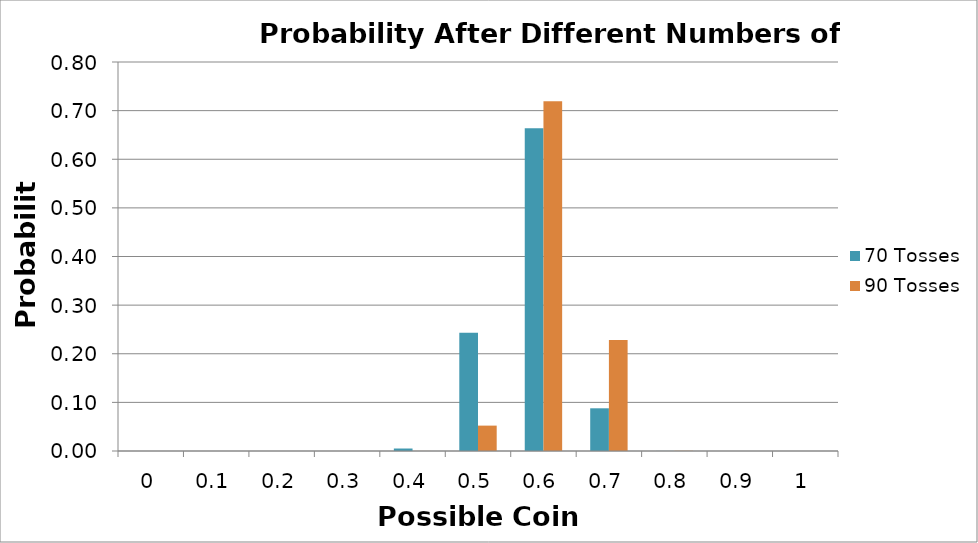
| Category | 70 Tosses | 90 Tosses |
|---|---|---|
| 0.0 | 0 | 0 |
| 0.1 | 0 | 0 |
| 0.2 | 0 | 0 |
| 0.3 | 0 | 0 |
| 0.4 | 0.005 | 0 |
| 0.5 | 0.243 | 0.052 |
| 0.6 | 0.664 | 0.719 |
| 0.7 | 0.088 | 0.228 |
| 0.8 | 0 | 0 |
| 0.9 | 0 | 0 |
| 1.0 | 0 | 0 |